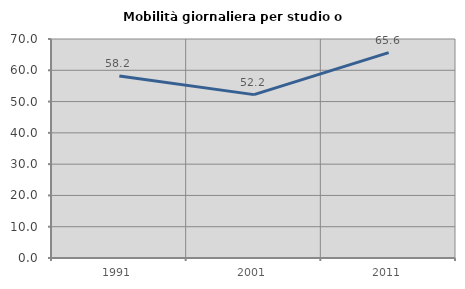
| Category | Mobilità giornaliera per studio o lavoro |
|---|---|
| 1991.0 | 58.196 |
| 2001.0 | 52.217 |
| 2011.0 | 65.648 |